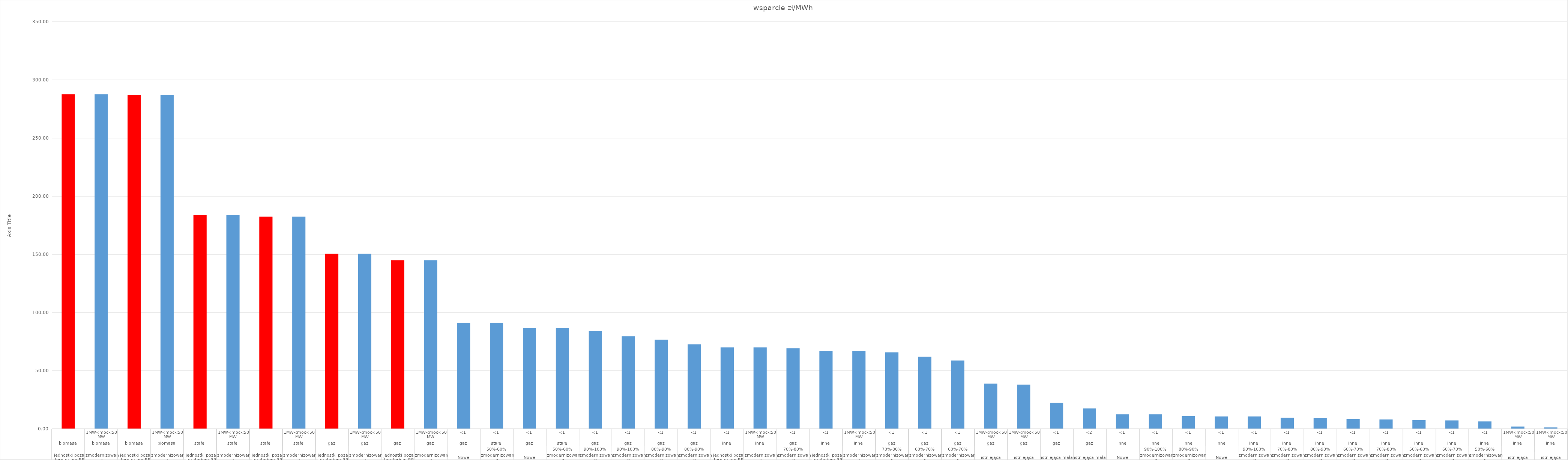
| Category | wsparcie |
|---|---|
| 0 | 287.64 |
| 1 | 287.64 |
| 2 | 286.78 |
| 3 | 286.78 |
| 4 | 183.84 |
| 5 | 183.84 |
| 6 | 182.44 |
| 7 | 182.44 |
| 8 | 150.65 |
| 9 | 150.65 |
| 10 | 144.93 |
| 11 | 144.93 |
| 12 | 91.2 |
| 13 | 91.2 |
| 14 | 86.48 |
| 15 | 86.48 |
| 16 | 83.9 |
| 17 | 79.56 |
| 18 | 76.61 |
| 19 | 72.64 |
| 20 | 70.04 |
| 21 | 70.04 |
| 22 | 69.31 |
| 23 | 67.09 |
| 24 | 67.09 |
| 25 | 65.73 |
| 26 | 62.02 |
| 27 | 58.81 |
| 28 | 38.9 |
| 29 | 38.05 |
| 30 | 22.34 |
| 31 | 17.59 |
| 32 | 12.48 |
| 33 | 12.48 |
| 34 | 10.98 |
| 35 | 10.65 |
| 36 | 10.65 |
| 37 | 9.49 |
| 38 | 9.37 |
| 39 | 8.49 |
| 40 | 8.09 |
| 41 | 7.49 |
| 42 | 7.24 |
| 43 | 6.39 |
| 44 | 2.04 |
| 45 | 1.2 |